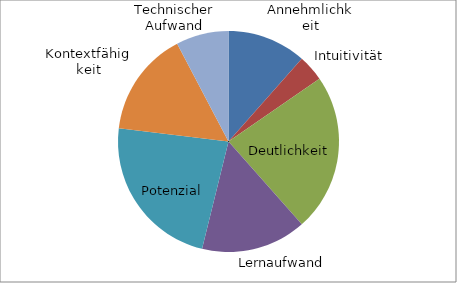
| Category | Series 0 |
|---|---|
| Annehmlichkeit | 12.5 |
| Intuitivität | 4.167 |
| Deutlichkeit | 25 |
| Lernaufwand | 16.667 |
| Potenzial | 25 |
| Kontextfähigkeit | 16.667 |
| Technischer Aufwand | 8.333 |